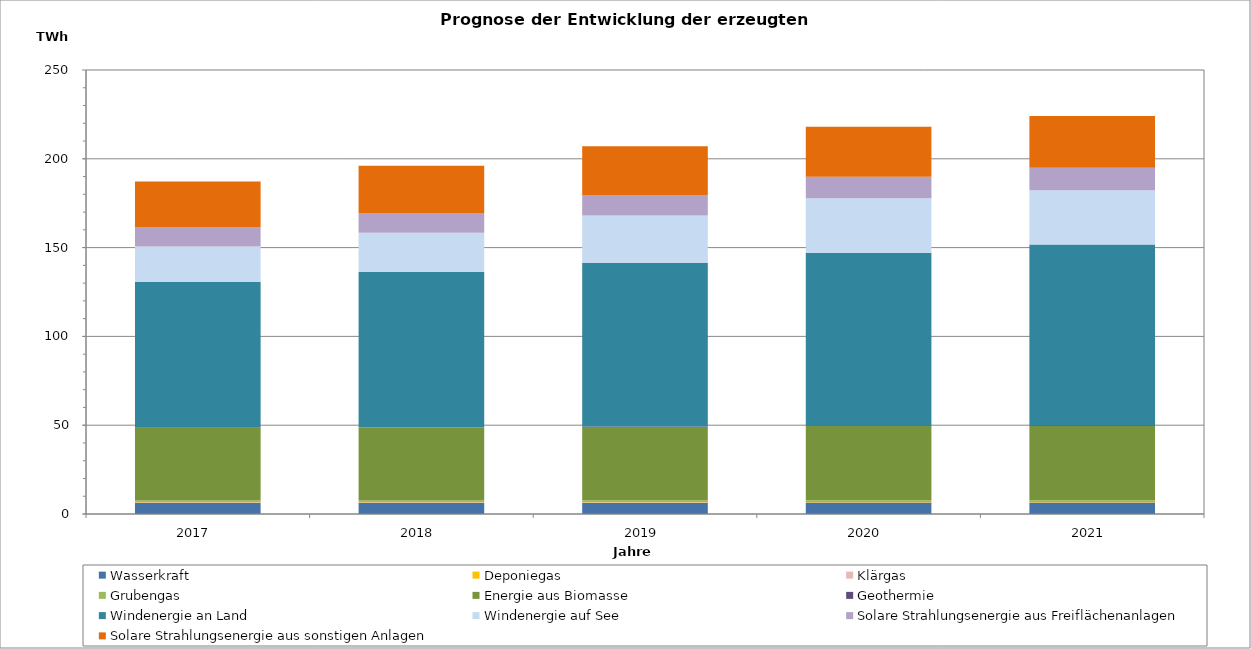
| Category | Wasserkraft | Deponiegas | Klärgas | Grubengas | Energie aus Biomasse | Geothermie | Windenergie an Land | Windenergie auf See | Solare Strahlungsenergie aus Freiflächenanlagen | Solare Strahlungsenergie aus sonstigen Anlagen |
|---|---|---|---|---|---|---|---|---|---|---|
| 2017.0 | 6280.817 | 352.623 | 66.82 | 968.63 | 40770.393 | 189.524 | 82001.903 | 20033.355 | 10599.501 | 25962.644 |
| 2018.0 | 6312.332 | 333.431 | 68.585 | 954.617 | 40981.485 | 249.571 | 87402.153 | 22114.719 | 11021.554 | 26641.196 |
| 2019.0 | 6350.951 | 316.684 | 70.394 | 940.788 | 41311.799 | 286.803 | 92134.6 | 26658.148 | 11561.703 | 27384.16 |
| 2020.0 | 6416.459 | 302.281 | 72.447 | 929.705 | 41892.56 | 346.785 | 97197.746 | 30593.451 | 12095.776 | 28254.05 |
| 2021.0 | 6440.639 | 286.678 | 74.148 | 913.67 | 41968.793 | 405.643 | 101676.081 | 30565.859 | 12597.255 | 29134.453 |